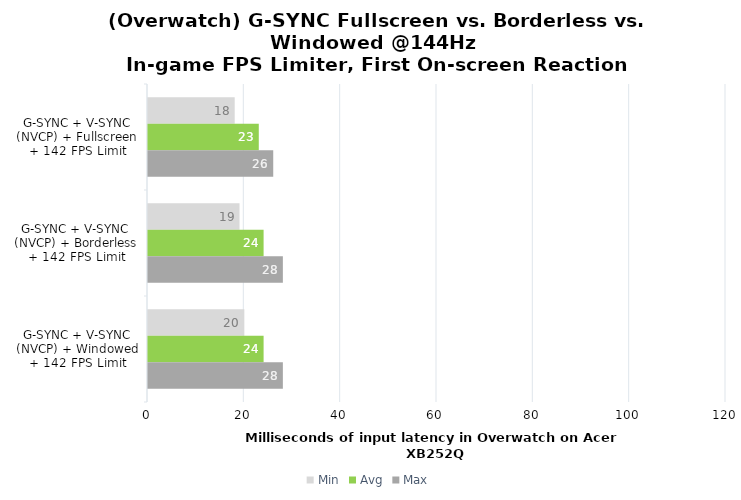
| Category | Min | Avg | Max |
|---|---|---|---|
| G-SYNC + V-SYNC (NVCP) + Fullscreen + 142 FPS Limit | 18 | 23 | 26 |
| G-SYNC + V-SYNC (NVCP) + Borderless + 142 FPS Limit | 19 | 24 | 28 |
| G-SYNC + V-SYNC (NVCP) + Windowed + 142 FPS Limit | 20 | 24 | 28 |